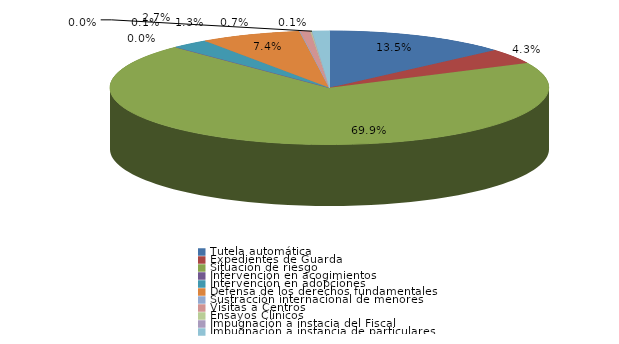
| Category | Series 0 |
|---|---|
| Tutela automática | 679 |
| Expedientes de Guarda | 215 |
| Situación de riesgo | 3511 |
| Intervención en acogimientos | 1 |
| Intervención en adopciones | 137 |
| Defensa de los derechos fundamentales | 372 |
| Sustracción internacional de menores | 3 |
| Visitas a Centros | 37 |
| Ensayos Clínicos | 6 |
| Impugnación a instacia del Fiscal | 0 |
| Impugnación a instancia de particulares | 64 |